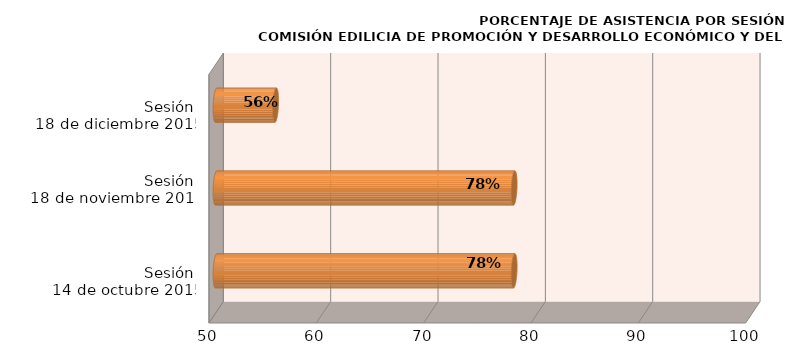
| Category | Series 0 |
|---|---|
| Sesión 
14 de octubre 2015 | 77.778 |
| Sesión 
18 de noviembre 2015 | 77.778 |
| Sesión 
18 de diciembre 2015 | 55.556 |